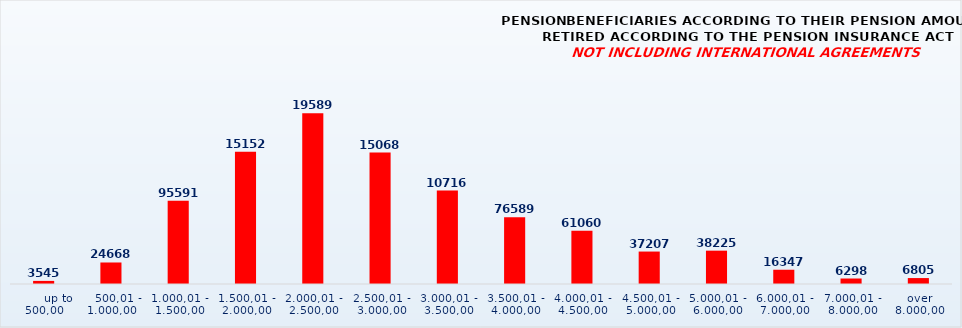
| Category | PENSION BENEFICIARIES ACCORDING TO TYPES AND AMOUNTS OF PENSION, RETIRED ACCORDING TO THE PENSION INSURANCE ACT
NOT INCLUDING INTERNATIONAL AGREEMENTS |
|---|---|
|       up to 500,00 | 3545 |
|    500,01 - 1.000,00 | 24668 |
| 1.000,01 - 1.500,00 | 95591 |
| 1.500,01 - 2.000,00 | 151526 |
| 2.000,01 - 2.500,00 | 195899 |
| 2.500,01 - 3.000,00 | 150687 |
| 3.000,01 - 3.500,00 | 107166 |
| 3.500,01 - 4.000,00 | 76589 |
| 4.000,01 - 4.500,00 | 61060 |
| 4.500,01 - 5.000,00 | 37207 |
| 5.000,01 - 6.000,00 | 38225 |
| 6.000,01 - 7.000,00 | 16347 |
| 7.000,01 - 8.000,00 | 6298 |
|  over  8.000,00 | 6805 |